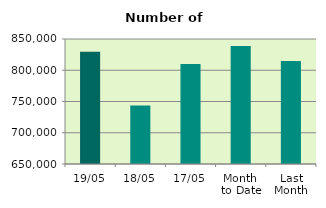
| Category | Series 0 |
|---|---|
| 19/05 | 829620 |
| 18/05 | 743570 |
| 17/05 | 809872 |
| Month 
to Date | 838762.571 |
| Last
Month | 814883.684 |